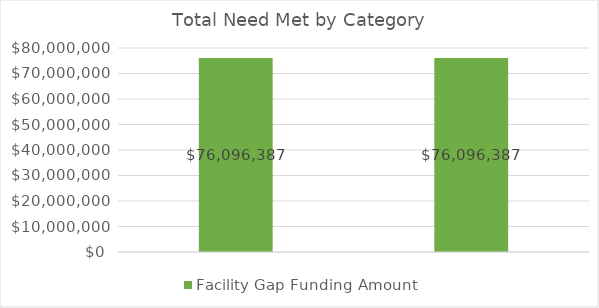
| Category | Facility Gap Funding Amount |
|---|---|
|  | 76096386.602 |
|  | 76096386.602 |